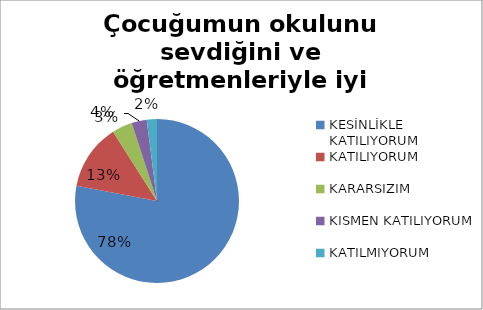
| Category | Çocuğumun okulunu sevdiğini ve öğretmenleriyle iyi anlaştığını düşünüyorum. |
|---|---|
| KESİNLİKLE KATILIYORUM | 156 |
| KATILIYORUM | 26 |
| KARARSIZIM | 8 |
| KISMEN KATILIYORUM | 6 |
| KATILMIYORUM | 4 |